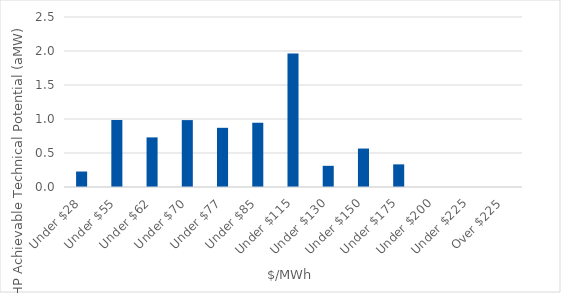
| Category | Series 0 |
|---|---|
| Under $28 | 0.228 |
| Under $55 | 0.985 |
| Under $62 | 0.73 |
| Under $70 | 0.984 |
| Under $77 | 0.87 |
| Under $85 | 0.945 |
| Under $115 | 1.962 |
| Under $130 | 0.312 |
| Under $150 | 0.565 |
| Under $175 | 0.333 |
| Under $200 | 0 |
| Under $225 | 0 |
| Over $225 | 0 |